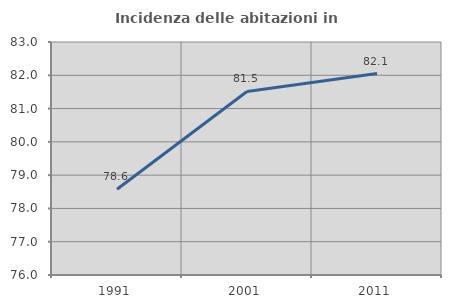
| Category | Incidenza delle abitazioni in proprietà  |
|---|---|
| 1991.0 | 78.577 |
| 2001.0 | 81.515 |
| 2011.0 | 82.053 |